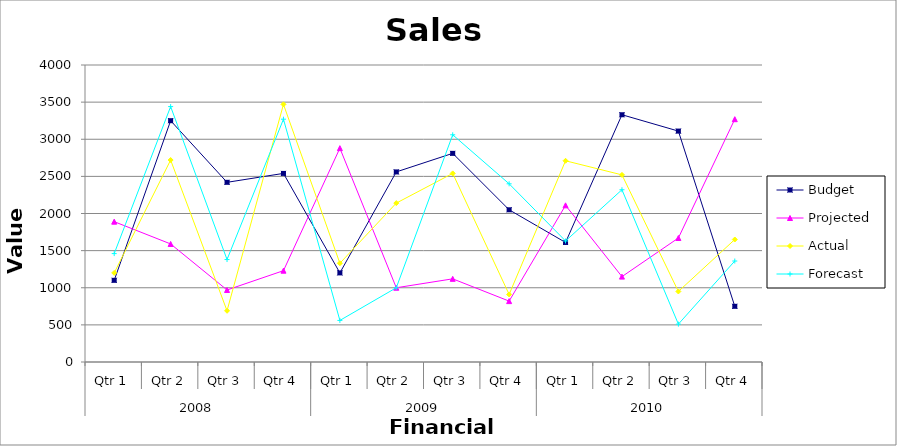
| Category | Budget | Projected | Actual | Forecast |
|---|---|---|---|---|
| 0 | 1100 | 1890 | 1200 | 1460 |
| 1 | 3250 | 1590 | 2720 | 3440 |
| 2 | 2420 | 970 | 690 | 1380 |
| 3 | 2540 | 1230 | 3470 | 3270 |
| 4 | 1200 | 2880 | 1330 | 560 |
| 5 | 2560 | 1000 | 2140 | 1000 |
| 6 | 2810 | 1120 | 2540 | 3060 |
| 7 | 2050 | 820 | 910 | 2400 |
| 8 | 1610 | 2110 | 2710 | 1630 |
| 9 | 3330 | 1150 | 2520 | 2320 |
| 10 | 3110 | 1670 | 950 | 510 |
| 11 | 750 | 3270 | 1650 | 1360 |